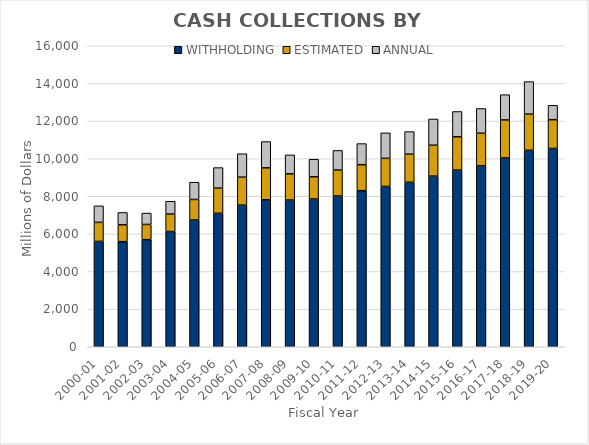
| Category | WITHHOLDING | ESTIMATED | ANNUAL |
|---|---|---|---|
| 2000-01 | 5598.544 | 1014.109 | 878.809 |
| 2001-02 | 5585.456 | 902.016 | 651.197 |
| 2002-03 | 5693.209 | 807.9 | 604.776 |
| 2003-04 | 6124.479 | 928.409 | 680.915 |
| 2004-05 | 6737.636 | 1092.56 | 916.596 |
| 2005-06 | 7094.353 | 1337.061 | 1092.725 |
| 2006-07 | 7528.691 | 1484.783 | 1248.145 |
| 2007-08 | 7810.938 | 1695.939 | 1400.864 |
| 2008-09 | 7798.587 | 1392.148 | 1007.912 |
| 2009-10 | 7851.711 | 1185.958 | 931.064 |
| 2010-11 | 8013.455 | 1380.534 | 1041.717 |
| 2011-12 | 8296.328 | 1381.924 | 1122.275 |
| 2012-13 | 8522.904 | 1493.615 | 1354.727 |
| 2013-14 | 8743.82 | 1493.343 | 1200.141 |
| 2014-15 | 9071.717 | 1641.695 | 1393.964 |
| 2015-16 | 9390.977 | 1773.114 | 1341.873 |
| 2016-17 | 9614.456 | 1735.653 | 1314.264 |
| 2017-18 | 10036.51 | 2019.892 | 1342.553 |
| 2018-19 | 10443.899 | 1922.399 | 1729.224 |
| 2019-20 | 10542.758 | 1528.56 | 763.683 |